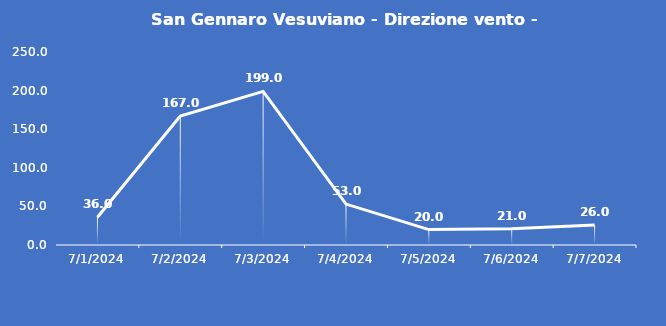
| Category | San Gennaro Vesuviano - Direzione vento - Grezzo (°N) |
|---|---|
| 7/1/24 | 36 |
| 7/2/24 | 167 |
| 7/3/24 | 199 |
| 7/4/24 | 53 |
| 7/5/24 | 20 |
| 7/6/24 | 21 |
| 7/7/24 | 26 |